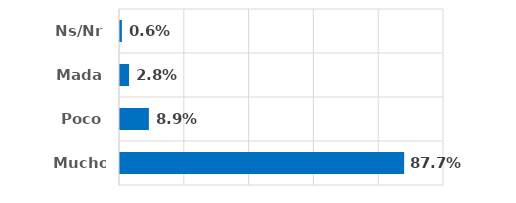
| Category | Series 0 |
|---|---|
| Mucho | 0.877 |
| Poco | 0.089 |
| Mada | 0.028 |
| Ns/Nr | 0.006 |